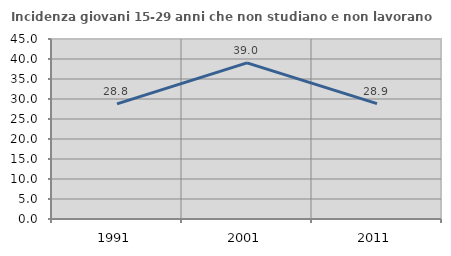
| Category | Incidenza giovani 15-29 anni che non studiano e non lavorano  |
|---|---|
| 1991.0 | 28.764 |
| 2001.0 | 39.042 |
| 2011.0 | 28.851 |